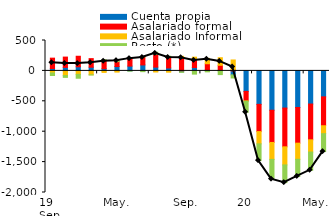
| Category | Cuenta propia | Asalariado formal | Asalariado Informal | Resto (*) |
|---|---|---|---|---|
| 2019-01-01 | 39.093 | 170.504 | -33.639 | -41.929 |
| 2019-02-01 | 57.907 | 169.173 | -76.404 | -30.119 |
| 2019-03-01 | 67.704 | 173.083 | -57.03 | -63.727 |
| 2019-04-01 | 60.717 | 141.24 | -63.972 | -3.051 |
| 2019-05-01 | 36.795 | 136.719 | -24.955 | 10.064 |
| 2019-06-01 | 71.778 | 80.703 | -19.329 | 33.906 |
| 2019-07-01 | 79.323 | 125.225 | 1.078 | -3.805 |
| 2019-08-01 | 98.207 | 132.837 | 2.387 | -12.577 |
| 2019-09-01 | 62.294 | 207.816 | -17.891 | 36.965 |
| 2019-10-01 | 48.273 | 185.48 | -20.795 | 7.566 |
| 2019-11-01 | -17.012 | 216.925 | 22.801 | -6.342 |
| 2019-12-01 | 55.183 | 139.325 | 31.241 | -52.865 |
| 2020-01-01 | 13.842 | 103.64 | 88.185 | -15.437 |
| 2020-02-01 | 6.696 | 85.253 | 124.752 | -60.964 |
| 2020-03-01 | -65.282 | 17.926 | 161.776 | -51.106 |
| 2020-04-01 | -337.379 | -156.584 | -4.827 | -181.296 |
| 2020-05-01 | -550.472 | -447.69 | -201.843 | -274.746 |
| 2020-06-01 | -647.245 | -529.594 | -278.639 | -324.742 |
| 2020-07-01 | -611.345 | -637.465 | -297.912 | -290.645 |
| 2020-08-01 | -601.679 | -586.797 | -265.208 | -282.156 |
| 2020-09-01 | -545.153 | -588.651 | -200.94 | -300.291 |
| 2020-10-01 | -427.002 | -475.026 | -130.165 | -294.509 |